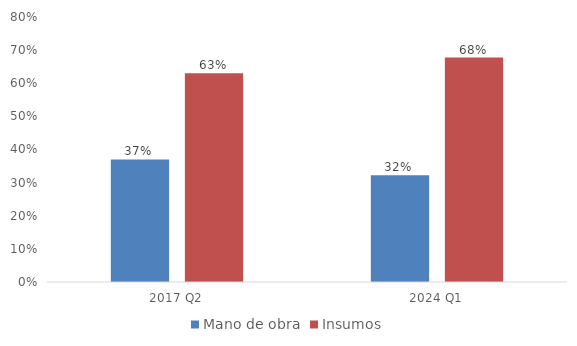
| Category | Mano de obra | Insumos |
|---|---|---|
| 2017 Q2 | 0.37 | 0.63 |
| 2024 Q1 | 0.322 | 0.678 |